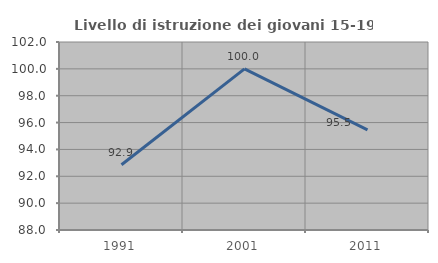
| Category | Livello di istruzione dei giovani 15-19 anni |
|---|---|
| 1991.0 | 92.857 |
| 2001.0 | 100 |
| 2011.0 | 95.455 |